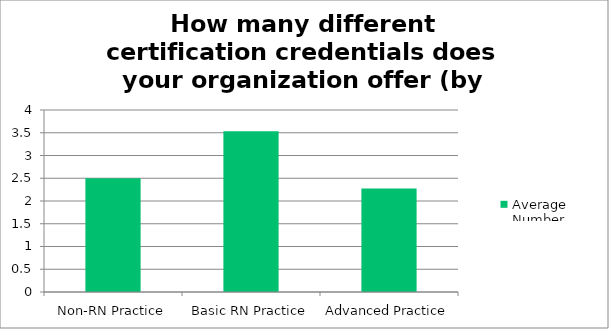
| Category | Average Number |
|---|---|
| Non-RN Practice | 2.5 |
| Basic RN Practice | 3.533 |
| Advanced Practice | 2.273 |